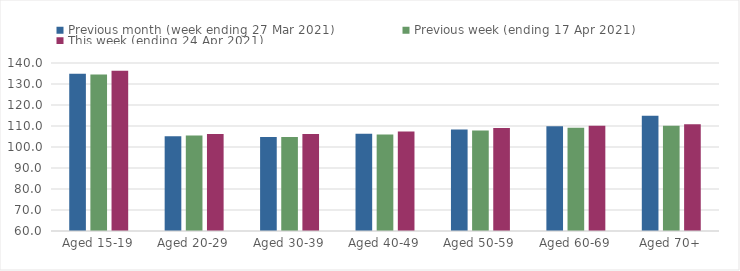
| Category | Previous month (week ending 27 Mar 2021) | Previous week (ending 17 Apr 2021) | This week (ending 24 Apr 2021) |
|---|---|---|---|
| Aged 15-19 | 134.85 | 134.5 | 136.26 |
| Aged 20-29 | 105.17 | 105.52 | 106.18 |
| Aged 30-39 | 104.72 | 104.72 | 106.2 |
| Aged 40-49 | 106.27 | 105.96 | 107.42 |
| Aged 50-59 | 108.32 | 107.85 | 109.02 |
| Aged 60-69 | 109.84 | 109.15 | 110.14 |
| Aged 70+ | 114.92 | 110.06 | 110.88 |